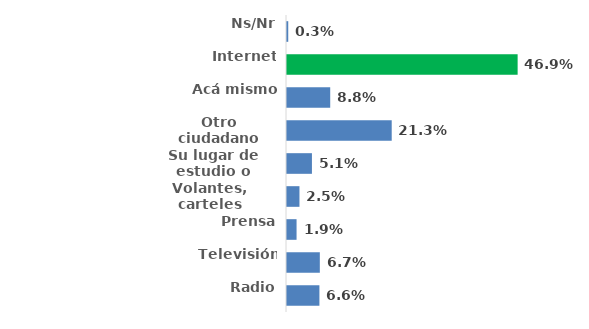
| Category | Series 0 |
|---|---|
| Radio | 0.066 |
| Televisión | 0.067 |
| Prensa | 0.019 |
| Volantes, carteles | 0.025 |
| Su lugar de estudio o trabajo | 0.051 |
| Otro ciudadano | 0.213 |
| Acá mismo | 0.088 |
| Internet | 0.469 |
| Ns/Nr | 0.003 |